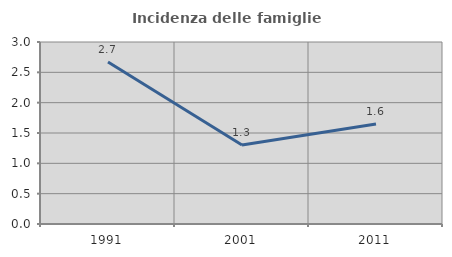
| Category | Incidenza delle famiglie numerose |
|---|---|
| 1991.0 | 2.669 |
| 2001.0 | 1.301 |
| 2011.0 | 1.648 |